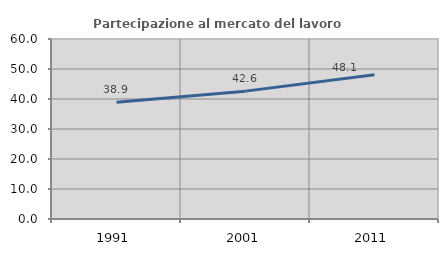
| Category | Partecipazione al mercato del lavoro  femminile |
|---|---|
| 1991.0 | 38.878 |
| 2001.0 | 42.622 |
| 2011.0 | 48.102 |